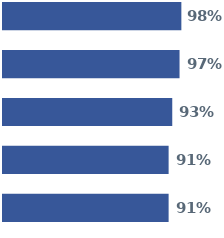
| Category | Series 0 | Series 1 | Series 2 | Series 3 | Series 4 |
|---|---|---|---|---|---|
| 0 | 0.98 | 0.97 | 0.93 | 0.91 | 0.91 |